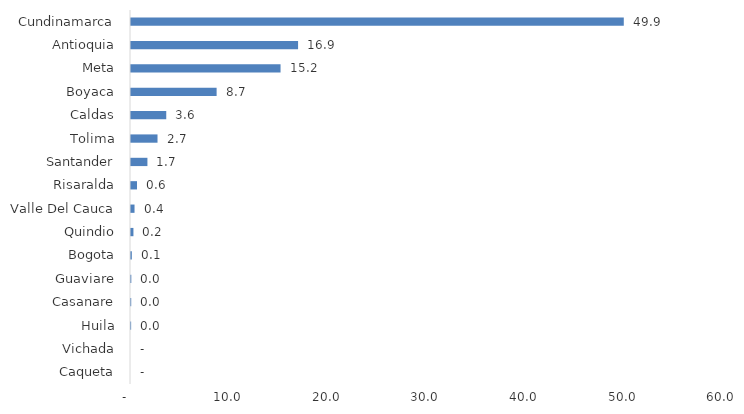
| Category | Series 0 |
|---|---|
| Caqueta | 0 |
| Vichada | 0 |
| Huila | 0.014 |
| Casanare | 0.022 |
| Guaviare | 0.032 |
| Bogota | 0.083 |
| Quindio | 0.247 |
| Valle Del Cauca | 0.358 |
| Risaralda | 0.608 |
| Santander | 1.664 |
| Tolima | 2.688 |
| Caldas | 3.573 |
| Boyaca | 8.677 |
| Meta | 15.157 |
| Antioquia | 16.934 |
| Cundinamarca | 49.944 |